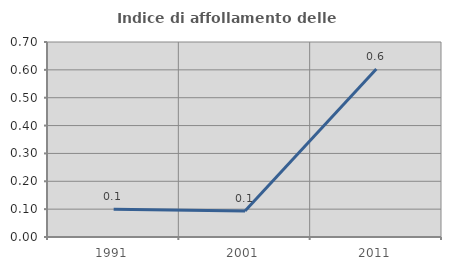
| Category | Indice di affollamento delle abitazioni  |
|---|---|
| 1991.0 | 0.1 |
| 2001.0 | 0.093 |
| 2011.0 | 0.603 |